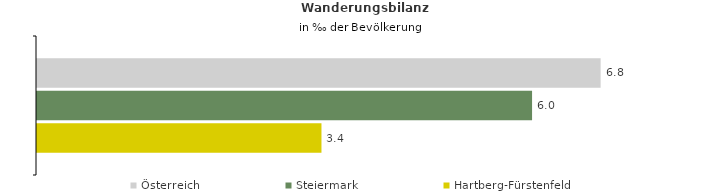
| Category | Österreich | Steiermark | Hartberg-Fürstenfeld |
|---|---|---|---|
| Wanderungsrate in ‰ der Bevölkerung, Periode 2018-2022 | 6.822 | 5.992 | 3.443 |